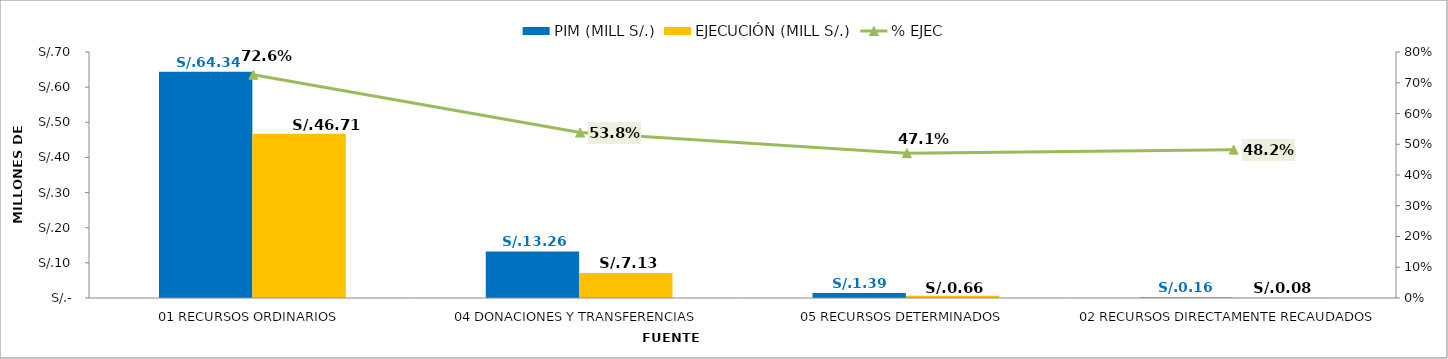
| Category | PIM (MILL S/.) | EJECUCIÓN (MILL S/.) |
|---|---|---|
| 01 RECURSOS ORDINARIOS | 64.345 | 46.714 |
| 04 DONACIONES Y TRANSFERENCIAS | 13.259 | 7.134 |
| 05 RECURSOS DETERMINADOS | 1.394 | 0.656 |
| 02 RECURSOS DIRECTAMENTE RECAUDADOS | 0.157 | 0.076 |